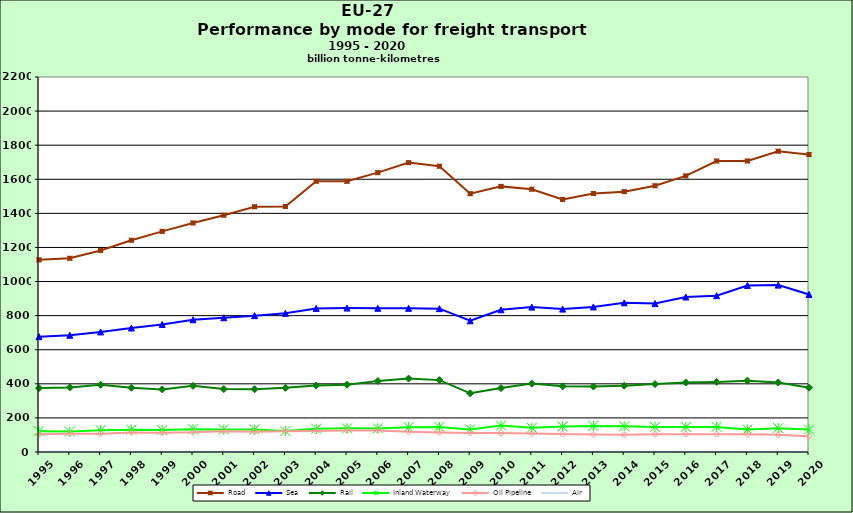
| Category | Road | Sea | Rail | Inland Waterway | Oil Pipeline | Air |
|---|---|---|---|---|---|---|
| 1995.0 | 1127.16 | 676.528 | 374.818 | 121.918 | 103.81 | 1.418 |
| 1996.0 | 1136.379 | 684.792 | 378.763 | 119.598 | 107.707 | 1.461 |
| 1997.0 | 1182.478 | 704.274 | 394.352 | 127.72 | 107.669 | 1.546 |
| 1998.0 | 1242.204 | 727.297 | 377.038 | 130.914 | 114.674 | 1.596 |
| 1999.0 | 1294.362 | 748.549 | 367.11 | 128.619 | 113.214 | 1.631 |
| 2000.0 | 1343.867 | 775.705 | 387.921 | 133.715 | 115.683 | 1.737 |
| 2001.0 | 1389.253 | 787.511 | 369.253 | 132.416 | 122.375 | 1.744 |
| 2002.0 | 1438.8 | 799.908 | 368.161 | 132.414 | 118.797 | 1.702 |
| 2003.0 | 1440.54 | 813.486 | 376.309 | 123.435 | 121.204 | 1.716 |
| 2004.0 | 1588.266 | 842.413 | 390.035 | 136.763 | 122.602 | 1.78 |
| 2005.0 | 1588.154 | 844.472 | 394.597 | 138.611 | 126.809 | 1.83 |
| 2006.0 | 1638.795 | 842.969 | 416.246 | 138.417 | 125.789 | 1.886 |
| 2007.0 | 1697.644 | 842.929 | 430.724 | 145.402 | 118.222 | 1.95 |
| 2008.0 | 1676.462 | 841.124 | 421.686 | 146.903 | 114.765 | 1.909 |
| 2009.0 | 1515.317 | 769.757 | 344.369 | 132.606 | 111.634 | 1.807 |
| 2010.0 | 1558.293 | 834.101 | 374.955 | 155.365 | 110.968 | 1.837 |
| 2011.0 | 1541.631 | 850.144 | 401.122 | 141.825 | 108.27 | 1.853 |
| 2012.0 | 1481.69 | 838.423 | 385.189 | 149.822 | 104.983 | 1.823 |
| 2013.0 | 1516.364 | 850.983 | 384.319 | 152.584 | 102.083 | 1.835 |
| 2014.0 | 1527.435 | 875.12 | 388.932 | 150.707 | 101.086 | 2.114 |
| 2015.0 | 1561.988 | 870.771 | 398.517 | 147.351 | 104.15 | 2.142 |
| 2016.0 | 1619.748 | 909.32 | 407.458 | 146.609 | 104.697 | 2.15 |
| 2017.0 | 1707.314 | 916.989 | 411.278 | 147.223 | 104.021 | 2.172 |
| 2018.0 | 1707.496 | 976.974 | 418.314 | 131.303 | 104.112 | 2.216 |
| 2019.0 | 1764.787 | 979.076 | 407.921 | 139.697 | 101.01 | 2.323 |
| 2020.0 | 1744.986 | 924.285 | 377.307 | 131.741 | 91.725 | 2.062 |